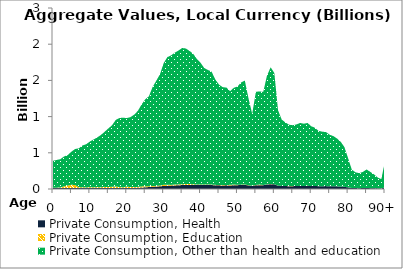
| Category | Private Consumption, Health | Private Consumption, Education | Private Consumption, Other than health and education |
|---|---|---|---|
| 0 | 12.712 | 5.722 | 371.148 |
|  | 13.341 | 5.305 | 382.397 |
| 2 | 13.905 | 7.011 | 391.212 |
| 3 | 14.684 | 22.319 | 412.672 |
| 4 | 14.638 | 32.737 | 421.1 |
| 5 | 15.136 | 43.713 | 457.367 |
| 6 | 15.411 | 38.954 | 498.428 |
| 7 | 15.114 | 10.551 | 535.765 |
| 8 | 15.079 | 10.215 | 576.717 |
| 9 | 14.514 | 6.846 | 597.4 |
| 10 | 14.234 | 12.087 | 629.118 |
| 11 | 14.111 | 8.424 | 661.73 |
| 12 | 14.196 | 12.418 | 685.397 |
| 13 | 14.113 | 9.976 | 723.155 |
| 14 | 13.954 | 15.665 | 760.898 |
| 15 | 14.142 | 12.866 | 809.586 |
| 16 | 14.339 | 17.131 | 848.777 |
| 17 | 14.82 | 19.891 | 918.498 |
| 18 | 15.252 | 11.871 | 953.711 |
| 19 | 15.459 | 7.44 | 961.53 |
| 20 | 14.952 | 18.311 | 946.89 |
| 21 | 14.776 | 11.732 | 966.247 |
| 22 | 15.793 | 11.44 | 999.443 |
| 23 | 17.673 | 11.414 | 1049.915 |
| 24 | 20.129 | 15.476 | 1130.409 |
| 25 | 23.465 | 16.277 | 1199.169 |
| 26 | 26.865 | 11.038 | 1243.31 |
| 27 | 31.198 | 11.851 | 1365.723 |
| 28 | 34.171 | 8.395 | 1453.015 |
| 29 | 37.328 | 11.247 | 1536.606 |
| 30 | 41.636 | 16.36 | 1680.755 |
| 31 | 44.525 | 15.661 | 1761.525 |
| 32 | 46.634 | 9.79 | 1788.754 |
| 33 | 49.196 | 13.566 | 1819.707 |
| 34 | 51.698 | 11.757 | 1848.39 |
| 35 | 54.514 | 12.073 | 1880.467 |
| 36 | 55.987 | 12.111 | 1873.092 |
| 37 | 56.465 | 11.827 | 1839.57 |
| 38 | 56.592 | 9.306 | 1802.225 |
| 39 | 55.66 | 6.379 | 1733.703 |
| 40 | 55.089 | 8.053 | 1680.223 |
| 41 | 53.761 | 8.498 | 1608.312 |
| 42 | 53.909 | 8.583 | 1582.148 |
| 43 | 54.247 | 6.852 | 1559.174 |
| 44 | 51.547 | 6.2 | 1454.474 |
| 45 | 50.141 | 3.721 | 1388.7 |
| 46 | 49.784 | 4.096 | 1352.636 |
| 47 | 50.257 | 4.956 | 1345.259 |
| 48 | 48.977 | 8.728 | 1293.746 |
| 49 | 51.253 | 11.104 | 1335.075 |
| 50 | 52.826 | 4.709 | 1357.973 |
| 51 | 55.526 | 4.887 | 1411.622 |
| 52 | 57.231 | 6.438 | 1433.764 |
| 53 | 48.69 | 2.823 | 1200.592 |
| 54 | 40.726 | 3.113 | 993.695 |
| 55 | 53.034 | 3.243 | 1287.22 |
| 56 | 53.179 | 8.59 | 1285.211 |
| 57 | 53.208 | 2.308 | 1286.474 |
| 58 | 61.772 | 3.389 | 1499.4 |
| 59 | 66.693 | 3.909 | 1610.493 |
| 60 | 64.766 | 1.366 | 1536.574 |
| 61 | 45.009 | 2.04 | 1041.593 |
| 62 | 40.742 | 0.932 | 916.932 |
| 63 | 40.128 | 1.022 | 878.411 |
| 64 | 39.324 | 1.057 | 846.974 |
| 65 | 39.498 | 0.574 | 841.361 |
| 66 | 40.356 | 0.977 | 850.94 |
| 67 | 41.588 | 0.664 | 869.636 |
| 68 | 41.583 | 0.499 | 859.597 |
| 69 | 42.664 | 1.068 | 868.594 |
| 70 | 41.281 | 0 | 825.97 |
| 71 | 40.805 | 0 | 805.22 |
| 72 | 39.257 | 0 | 763.286 |
| 73 | 39.435 | 0 | 752.596 |
| 74 | 39.811 | 0 | 747.129 |
| 75 | 38.42 | 0 | 711.296 |
| 76 | 37.834 | 0 | 692.762 |
| 77 | 36.329 | 0 | 661.23 |
| 78 | 33.924 | 0 | 618.061 |
| 79 | 30.087 | 0 | 549.199 |
| 80 | 22.173 | 0 | 402.748 |
| 81 | 14.039 | 0 | 252.973 |
| 82 | 12.268 | 0 | 218.296 |
| 83 | 11.737 | 0 | 206.858 |
| 84 | 12.56 | 0 | 223.382 |
| 85 | 13.865 | 0 | 255.926 |
| 86 | 11.747 | 0 | 225.525 |
| 87 | 9.896 | 0 | 193.57 |
| 88 | 8.296 | 0 | 151.981 |
| 89 | 7.519 | 0 | 127.946 |
| 90+ | 22.753 | 0 | 360.976 |